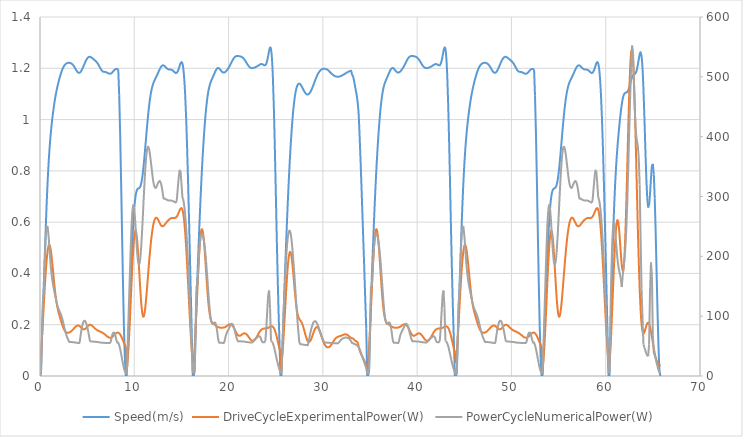
| Category | Speed(m/s) |
|---|---|
| 0.0 | 0 |
| 0.1 | 0.006 |
| 0.2 | 0.129 |
| 0.3 | 0.255 |
| 0.4 | 0.355 |
| 0.5 | 0.462 |
| 0.6 | 0.568 |
| 0.7 | 0.666 |
| 0.8 | 0.751 |
| 0.9 | 0.823 |
| 1.0 | 0.881 |
| 1.1 | 0.929 |
| 1.2 | 0.968 |
| 1.3 | 1.002 |
| 1.4 | 1.032 |
| 1.5 | 1.058 |
| 1.6 | 1.082 |
| 1.7 | 1.102 |
| 1.8 | 1.121 |
| 1.9 | 1.137 |
| 2.0 | 1.152 |
| 2.1 | 1.165 |
| 2.2 | 1.178 |
| 2.3 | 1.189 |
| 2.4 | 1.198 |
| 2.5 | 1.206 |
| 2.6 | 1.212 |
| 2.7 | 1.216 |
| 2.8 | 1.219 |
| 2.9 | 1.22 |
| 3.0 | 1.221 |
| 3.1 | 1.221 |
| 3.2 | 1.221 |
| 3.3 | 1.219 |
| 3.4 | 1.217 |
| 3.5 | 1.213 |
| 3.6 | 1.208 |
| 3.7 | 1.202 |
| 3.8 | 1.196 |
| 3.9 | 1.19 |
| 4.0 | 1.185 |
| 4.1 | 1.182 |
| 4.2 | 1.183 |
| 4.3 | 1.186 |
| 4.4 | 1.191 |
| 4.5 | 1.198 |
| 4.6 | 1.207 |
| 4.7 | 1.216 |
| 4.8 | 1.224 |
| 4.9 | 1.232 |
| 5.0 | 1.238 |
| 5.1 | 1.242 |
| 5.2 | 1.244 |
| 5.3 | 1.245 |
| 5.4 | 1.243 |
| 5.5 | 1.241 |
| 5.6 | 1.238 |
| 5.7 | 1.235 |
| 5.8 | 1.232 |
| 5.9 | 1.228 |
| 6.0 | 1.224 |
| 6.1 | 1.22 |
| 6.2 | 1.214 |
| 6.3 | 1.207 |
| 6.4 | 1.2 |
| 6.5 | 1.194 |
| 6.6 | 1.189 |
| 6.7 | 1.187 |
| 6.8 | 1.186 |
| 6.9 | 1.186 |
| 7.0 | 1.185 |
| 7.1 | 1.183 |
| 7.2 | 1.181 |
| 7.3 | 1.179 |
| 7.4 | 1.179 |
| 7.5 | 1.179 |
| 7.6 | 1.182 |
| 7.7 | 1.185 |
| 7.8 | 1.19 |
| 7.9 | 1.194 |
| 8.0 | 1.196 |
| 8.1 | 1.198 |
| 8.2 | 1.197 |
| 8.3 | 1.196 |
| 8.4 | 1.095 |
| 8.5 | 0.948 |
| 8.6 | 0.763 |
| 8.7 | 0.561 |
| 8.8 | 0.364 |
| 8.9 | 0.195 |
| 9.0 | 0.07 |
| 9.1 | 0 |
| 9.2 | 0 |
| 9.3 | 0.09 |
| 9.4 | 0.18 |
| 9.5 | 0.273 |
| 9.6 | 0.365 |
| 9.7 | 0.453 |
| 9.8 | 0.534 |
| 9.9 | 0.602 |
| 10.0 | 0.655 |
| 10.1 | 0.692 |
| 10.2 | 0.715 |
| 10.3 | 0.726 |
| 10.4 | 0.731 |
| 10.5 | 0.733 |
| 10.6 | 0.736 |
| 10.7 | 0.746 |
| 10.8 | 0.764 |
| 10.9 | 0.79 |
| 11.0 | 0.824 |
| 11.1 | 0.864 |
| 11.2 | 0.907 |
| 11.3 | 0.95 |
| 11.4 | 0.992 |
| 11.5 | 1.03 |
| 11.6 | 1.062 |
| 11.7 | 1.089 |
| 11.8 | 1.111 |
| 11.9 | 1.127 |
| 12.0 | 1.14 |
| 12.1 | 1.149 |
| 12.2 | 1.157 |
| 12.3 | 1.164 |
| 12.4 | 1.172 |
| 12.5 | 1.18 |
| 12.6 | 1.189 |
| 12.7 | 1.197 |
| 12.8 | 1.204 |
| 12.9 | 1.209 |
| 13.0 | 1.211 |
| 13.1 | 1.211 |
| 13.2 | 1.209 |
| 13.3 | 1.205 |
| 13.4 | 1.202 |
| 13.5 | 1.198 |
| 13.6 | 1.196 |
| 13.7 | 1.195 |
| 13.8 | 1.195 |
| 13.9 | 1.195 |
| 14.0 | 1.193 |
| 14.1 | 1.191 |
| 14.2 | 1.187 |
| 14.3 | 1.184 |
| 14.4 | 1.182 |
| 14.5 | 1.183 |
| 14.6 | 1.188 |
| 14.7 | 1.196 |
| 14.8 | 1.208 |
| 14.9 | 1.219 |
| 15.0 | 1.224 |
| 15.1 | 1.219 |
| 15.2 | 1.199 |
| 15.3 | 1.158 |
| 15.4 | 1.094 |
| 15.5 | 1.006 |
| 15.6 | 0.895 |
| 15.7 | 0.764 |
| 15.8 | 0.62 |
| 15.9 | 0.467 |
| 16.0 | 0.312 |
| 16.1 | 0.157 |
| 16.2 | 0 |
| 16.3 | 0 |
| 16.4 | 0.021 |
| 16.5 | 0.156 |
| 16.6 | 0.292 |
| 16.7 | 0.392 |
| 16.8 | 0.489 |
| 16.9 | 0.582 |
| 17.0 | 0.67 |
| 17.1 | 0.75 |
| 17.2 | 0.822 |
| 17.3 | 0.887 |
| 17.4 | 0.944 |
| 17.5 | 0.993 |
| 17.6 | 1.036 |
| 17.7 | 1.07 |
| 17.8 | 1.098 |
| 17.9 | 1.119 |
| 18.0 | 1.134 |
| 18.1 | 1.145 |
| 18.2 | 1.154 |
| 18.3 | 1.163 |
| 18.4 | 1.171 |
| 18.5 | 1.18 |
| 18.6 | 1.188 |
| 18.7 | 1.195 |
| 18.8 | 1.2 |
| 18.9 | 1.201 |
| 19.0 | 1.199 |
| 19.1 | 1.196 |
| 19.2 | 1.191 |
| 19.3 | 1.187 |
| 19.4 | 1.184 |
| 19.5 | 1.183 |
| 19.6 | 1.184 |
| 19.7 | 1.187 |
| 19.8 | 1.191 |
| 19.9 | 1.196 |
| 20.0 | 1.202 |
| 20.1 | 1.208 |
| 20.2 | 1.215 |
| 20.3 | 1.222 |
| 20.4 | 1.23 |
| 20.5 | 1.236 |
| 20.6 | 1.241 |
| 20.7 | 1.245 |
| 20.8 | 1.247 |
| 20.9 | 1.248 |
| 21.0 | 1.248 |
| 21.1 | 1.247 |
| 21.2 | 1.247 |
| 21.3 | 1.246 |
| 21.4 | 1.244 |
| 21.5 | 1.242 |
| 21.6 | 1.238 |
| 21.7 | 1.233 |
| 21.8 | 1.228 |
| 21.9 | 1.222 |
| 22.0 | 1.216 |
| 22.1 | 1.21 |
| 22.2 | 1.206 |
| 22.3 | 1.203 |
| 22.4 | 1.201 |
| 22.5 | 1.2 |
| 22.6 | 1.201 |
| 22.7 | 1.202 |
| 22.8 | 1.203 |
| 22.9 | 1.205 |
| 23.0 | 1.207 |
| 23.1 | 1.209 |
| 23.2 | 1.212 |
| 23.3 | 1.214 |
| 23.4 | 1.216 |
| 23.5 | 1.216 |
| 23.6 | 1.216 |
| 23.7 | 1.214 |
| 23.8 | 1.212 |
| 23.9 | 1.212 |
| 24.0 | 1.218 |
| 24.1 | 1.23 |
| 24.2 | 1.248 |
| 24.3 | 1.268 |
| 24.4 | 1.281 |
| 24.5 | 1.275 |
| 24.6 | 1.239 |
| 24.7 | 1.164 |
| 24.8 | 1.05 |
| 24.9 | 0.902 |
| 25.0 | 0.732 |
| 25.1 | 0.559 |
| 25.2 | 0.396 |
| 25.3 | 0.253 |
| 25.4 | 0.13 |
| 25.5 | 0 |
| 25.6 | 0 |
| 25.7 | 0.101 |
| 25.8 | 0.209 |
| 25.9 | 0.314 |
| 26.0 | 0.416 |
| 26.1 | 0.514 |
| 26.2 | 0.607 |
| 26.3 | 0.693 |
| 26.4 | 0.772 |
| 26.5 | 0.844 |
| 26.6 | 0.908 |
| 26.7 | 0.964 |
| 26.8 | 1.011 |
| 26.9 | 1.05 |
| 27.0 | 1.082 |
| 27.1 | 1.105 |
| 27.2 | 1.122 |
| 27.3 | 1.133 |
| 27.4 | 1.139 |
| 27.5 | 1.14 |
| 27.6 | 1.138 |
| 27.7 | 1.133 |
| 27.8 | 1.126 |
| 27.9 | 1.119 |
| 28.0 | 1.112 |
| 28.1 | 1.106 |
| 28.2 | 1.101 |
| 28.3 | 1.098 |
| 28.4 | 1.098 |
| 28.5 | 1.099 |
| 28.6 | 1.103 |
| 28.7 | 1.109 |
| 28.8 | 1.117 |
| 28.9 | 1.125 |
| 29.0 | 1.135 |
| 29.1 | 1.145 |
| 29.2 | 1.155 |
| 29.3 | 1.164 |
| 29.4 | 1.172 |
| 29.5 | 1.179 |
| 29.6 | 1.185 |
| 29.7 | 1.19 |
| 29.8 | 1.194 |
| 29.9 | 1.196 |
| 30.0 | 1.198 |
| 30.1 | 1.198 |
| 30.2 | 1.198 |
| 30.3 | 1.197 |
| 30.4 | 1.196 |
| 30.5 | 1.194 |
| 30.6 | 1.191 |
| 30.7 | 1.187 |
| 30.8 | 1.184 |
| 30.9 | 1.18 |
| 31.0 | 1.176 |
| 31.1 | 1.174 |
| 31.2 | 1.171 |
| 31.3 | 1.169 |
| 31.4 | 1.168 |
| 31.5 | 1.167 |
| 31.6 | 1.167 |
| 31.7 | 1.167 |
| 31.8 | 1.168 |
| 31.9 | 1.17 |
| 32.0 | 1.171 |
| 32.1 | 1.173 |
| 32.2 | 1.175 |
| 32.3 | 1.178 |
| 32.4 | 1.18 |
| 32.5 | 1.182 |
| 32.6 | 1.184 |
| 32.7 | 1.186 |
| 32.8 | 1.188 |
| 32.9 | 1.189 |
| 33.0 | 1.19 |
| 33.1 | 1.175 |
| 33.2 | 1.169 |
| 33.3 | 1.153 |
| 33.4 | 1.133 |
| 33.5 | 1.113 |
| 33.6 | 1.093 |
| 33.7 | 1.063 |
| 33.8 | 1.019 |
| 33.9 | 0.935 |
| 34.0 | 0.838 |
| 34.1 | 0.735 |
| 34.2 | 0.628 |
| 34.3 | 0.519 |
| 34.4 | 0.411 |
| 34.5 | 0.296 |
| 34.6 | 0.187 |
| 34.7 | 0 |
| 34.8 | 0 |
| 34.9 | 0.021 |
| 35.0 | 0.156 |
| 35.1 | 0.292 |
| 35.2 | 0.392 |
| 35.3 | 0.489 |
| 35.4 | 0.582 |
| 35.5 | 0.67 |
| 35.6 | 0.75 |
| 35.7 | 0.822 |
| 35.8 | 0.887 |
| 35.9 | 0.944 |
| 36.0 | 0.993 |
| 36.1 | 1.036 |
| 36.2 | 1.07 |
| 36.3 | 1.098 |
| 36.4 | 1.119 |
| 36.5 | 1.134 |
| 36.6 | 1.145 |
| 36.7 | 1.154 |
| 36.8 | 1.163 |
| 36.9 | 1.171 |
| 37.0 | 1.18 |
| 37.1 | 1.188 |
| 37.2 | 1.195 |
| 37.3 | 1.2 |
| 37.4 | 1.201 |
| 37.5 | 1.199 |
| 37.6 | 1.196 |
| 37.7 | 1.191 |
| 37.8 | 1.187 |
| 37.9 | 1.184 |
| 38.0 | 1.183 |
| 38.1 | 1.184 |
| 38.2 | 1.187 |
| 38.3 | 1.191 |
| 38.4 | 1.196 |
| 38.5 | 1.202 |
| 38.6 | 1.208 |
| 38.7 | 1.215 |
| 38.8 | 1.222 |
| 38.9 | 1.23 |
| 39.0 | 1.236 |
| 39.1 | 1.241 |
| 39.2 | 1.245 |
| 39.3 | 1.247 |
| 39.4 | 1.248 |
| 39.5 | 1.248 |
| 39.6 | 1.247 |
| 39.7 | 1.247 |
| 39.8 | 1.246 |
| 39.9 | 1.244 |
| 40.0 | 1.242 |
| 40.1 | 1.238 |
| 40.2 | 1.233 |
| 40.3 | 1.228 |
| 40.4 | 1.222 |
| 40.5 | 1.216 |
| 40.6 | 1.21 |
| 40.7 | 1.206 |
| 40.8 | 1.203 |
| 40.9 | 1.201 |
| 41.0 | 1.2 |
| 41.1 | 1.201 |
| 41.2 | 1.202 |
| 41.3 | 1.203 |
| 41.4 | 1.205 |
| 41.5 | 1.207 |
| 41.6 | 1.209 |
| 41.7 | 1.212 |
| 41.8 | 1.214 |
| 41.9 | 1.216 |
| 42.0 | 1.216 |
| 42.1 | 1.216 |
| 42.2 | 1.214 |
| 42.3 | 1.212 |
| 42.4 | 1.212 |
| 42.5 | 1.218 |
| 42.6 | 1.23 |
| 42.7 | 1.248 |
| 42.8 | 1.268 |
| 42.9 | 1.281 |
| 43.0 | 1.275 |
| 43.1 | 1.239 |
| 43.2 | 1.164 |
| 43.3 | 1.05 |
| 43.4 | 0.902 |
| 43.5 | 0.732 |
| 43.6 | 0.559 |
| 43.7 | 0.396 |
| 43.8 | 0.253 |
| 43.9 | 0.13 |
| 44.0 | 0 |
| 44.1 | 0 |
| 44.2 | 0.006 |
| 44.3 | 0.129 |
| 44.4 | 0.255 |
| 44.5 | 0.355 |
| 44.6 | 0.462 |
| 44.7 | 0.568 |
| 44.8 | 0.666 |
| 44.9 | 0.751 |
| 45.0 | 0.823 |
| 45.1 | 0.881 |
| 45.2 | 0.929 |
| 45.3 | 0.968 |
| 45.4 | 1.002 |
| 45.5 | 1.032 |
| 45.6 | 1.058 |
| 45.7 | 1.082 |
| 45.8 | 1.102 |
| 45.9 | 1.121 |
| 46.0 | 1.137 |
| 46.1 | 1.152 |
| 46.2 | 1.165 |
| 46.3 | 1.178 |
| 46.4 | 1.189 |
| 46.5 | 1.198 |
| 46.6 | 1.206 |
| 46.7 | 1.212 |
| 46.8 | 1.216 |
| 46.9 | 1.219 |
| 47.0 | 1.22 |
| 47.1 | 1.221 |
| 47.2 | 1.221 |
| 47.3 | 1.221 |
| 47.4 | 1.219 |
| 47.5 | 1.217 |
| 47.6 | 1.213 |
| 47.7 | 1.208 |
| 47.8 | 1.202 |
| 47.9 | 1.196 |
| 48.0 | 1.19 |
| 48.1 | 1.185 |
| 48.2 | 1.182 |
| 48.3 | 1.183 |
| 48.4 | 1.186 |
| 48.5 | 1.191 |
| 48.6 | 1.198 |
| 48.7 | 1.207 |
| 48.8 | 1.216 |
| 48.9 | 1.224 |
| 49.0 | 1.232 |
| 49.1 | 1.238 |
| 49.2 | 1.242 |
| 49.3 | 1.244 |
| 49.4 | 1.245 |
| 49.5 | 1.243 |
| 49.6 | 1.241 |
| 49.7 | 1.238 |
| 49.8 | 1.235 |
| 49.9 | 1.232 |
| 50.0 | 1.228 |
| 50.1 | 1.224 |
| 50.2 | 1.22 |
| 50.3 | 1.214 |
| 50.4 | 1.207 |
| 50.5 | 1.2 |
| 50.6 | 1.194 |
| 50.7 | 1.189 |
| 50.8 | 1.187 |
| 50.9 | 1.186 |
| 51.0 | 1.186 |
| 51.1 | 1.185 |
| 51.2 | 1.183 |
| 51.3 | 1.181 |
| 51.4 | 1.179 |
| 51.5 | 1.179 |
| 51.6 | 1.179 |
| 51.7 | 1.182 |
| 51.8 | 1.185 |
| 51.9 | 1.19 |
| 52.0 | 1.194 |
| 52.1 | 1.196 |
| 52.2 | 1.198 |
| 52.3 | 1.197 |
| 52.4 | 1.196 |
| 52.5 | 1.095 |
| 52.6 | 0.948 |
| 52.7 | 0.763 |
| 52.8 | 0.561 |
| 52.9 | 0.364 |
| 53.0 | 0.195 |
| 53.1 | 0.07 |
| 53.2 | 0 |
| 53.3 | 0 |
| 53.4 | 0.09 |
| 53.5 | 0.18 |
| 53.6 | 0.273 |
| 53.7 | 0.365 |
| 53.8 | 0.453 |
| 53.9 | 0.534 |
| 54.0 | 0.602 |
| 54.1 | 0.655 |
| 54.2 | 0.692 |
| 54.3 | 0.715 |
| 54.4 | 0.726 |
| 54.5 | 0.731 |
| 54.6 | 0.733 |
| 54.7 | 0.736 |
| 54.8 | 0.746 |
| 54.9 | 0.764 |
| 55.0 | 0.79 |
| 55.1 | 0.824 |
| 55.2 | 0.864 |
| 55.3 | 0.907 |
| 55.4 | 0.95 |
| 55.5 | 0.992 |
| 55.6 | 1.03 |
| 55.7 | 1.062 |
| 55.8 | 1.089 |
| 55.9 | 1.111 |
| 56.0 | 1.127 |
| 56.1 | 1.14 |
| 56.2 | 1.149 |
| 56.3 | 1.157 |
| 56.4 | 1.164 |
| 56.5 | 1.172 |
| 56.6 | 1.18 |
| 56.7 | 1.189 |
| 56.8 | 1.197 |
| 56.9 | 1.204 |
| 57.0 | 1.209 |
| 57.1 | 1.211 |
| 57.2 | 1.211 |
| 57.3 | 1.209 |
| 57.4 | 1.205 |
| 57.5 | 1.202 |
| 57.6 | 1.198 |
| 57.7 | 1.196 |
| 57.8 | 1.195 |
| 57.9 | 1.195 |
| 58.0 | 1.195 |
| 58.1 | 1.193 |
| 58.2 | 1.191 |
| 58.3 | 1.187 |
| 58.4 | 1.184 |
| 58.5 | 1.182 |
| 58.6 | 1.183 |
| 58.7 | 1.188 |
| 58.8 | 1.196 |
| 58.9 | 1.208 |
| 59.0 | 1.219 |
| 59.1 | 1.224 |
| 59.2 | 1.219 |
| 59.3 | 1.199 |
| 59.4 | 1.158 |
| 59.5 | 1.094 |
| 59.6 | 1.006 |
| 59.7 | 0.895 |
| 59.8 | 0.764 |
| 59.9 | 0.62 |
| 60.0 | 0.467 |
| 60.1 | 0.312 |
| 60.2 | 0.157 |
| 60.3 | 0 |
| 60.4 | 0 |
| 60.5 | 0.159 |
| 60.6 | 0.309 |
| 60.7 | 0.446 |
| 60.8 | 0.565 |
| 60.9 | 0.666 |
| 61.0 | 0.748 |
| 61.1 | 0.816 |
| 61.2 | 0.871 |
| 61.3 | 0.919 |
| 61.4 | 0.96 |
| 61.5 | 0.997 |
| 61.6 | 1.03 |
| 61.7 | 1.058 |
| 61.8 | 1.08 |
| 61.9 | 1.094 |
| 62.0 | 1.102 |
| 62.1 | 1.105 |
| 62.2 | 1.106 |
| 62.3 | 1.108 |
| 62.4 | 1.115 |
| 62.5 | 1.126 |
| 62.6 | 1.14 |
| 62.7 | 1.154 |
| 62.8 | 1.166 |
| 62.9 | 1.173 |
| 63.0 | 1.176 |
| 63.1 | 1.179 |
| 63.2 | 1.184 |
| 63.3 | 1.194 |
| 63.4 | 1.212 |
| 63.5 | 1.234 |
| 63.6 | 1.254 |
| 63.7 | 1.262 |
| 63.8 | 1.248 |
| 63.9 | 1.202 |
| 64.0 | 1.122 |
| 64.1 | 1.013 |
| 64.2 | 0.892 |
| 64.3 | 0.779 |
| 64.4 | 0.696 |
| 64.5 | 0.657 |
| 64.6 | 0.666 |
| 64.7 | 0.711 |
| 64.8 | 0.77 |
| 64.9 | 0.817 |
| 65.0 | 0.827 |
| 65.1 | 0.786 |
| 65.2 | 0.692 |
| 65.3 | 0.557 |
| 65.4 | 0.4 |
| 65.5 | 0.246 |
| 65.6 | 0.114 |
| 65.7 | 0.02 |
| 65.8 | 0 |